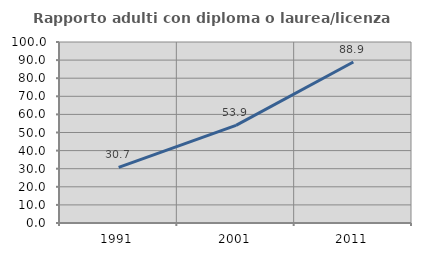
| Category | Rapporto adulti con diploma o laurea/licenza media  |
|---|---|
| 1991.0 | 30.714 |
| 2001.0 | 53.927 |
| 2011.0 | 88.938 |